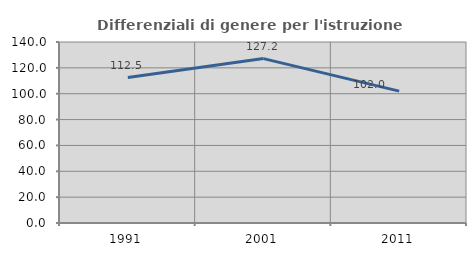
| Category | Differenziali di genere per l'istruzione superiore |
|---|---|
| 1991.0 | 112.538 |
| 2001.0 | 127.155 |
| 2011.0 | 102.019 |